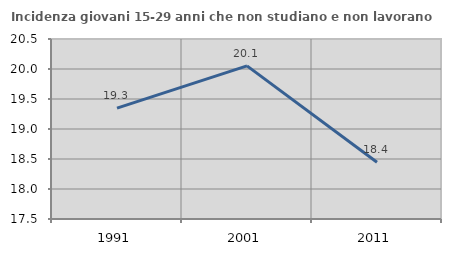
| Category | Incidenza giovani 15-29 anni che non studiano e non lavorano  |
|---|---|
| 1991.0 | 19.347 |
| 2001.0 | 20.052 |
| 2011.0 | 18.447 |